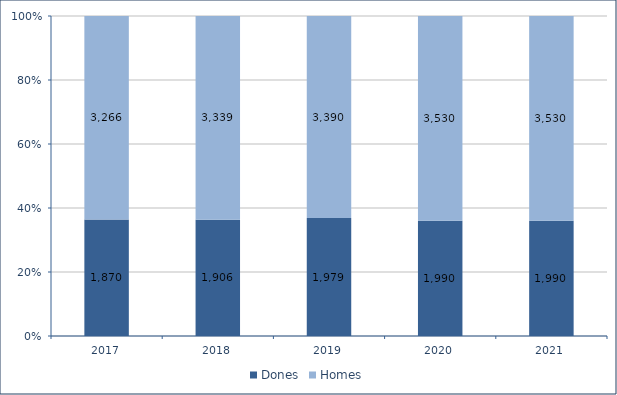
| Category | Dones | Homes |
|---|---|---|
| 2017.0 | 1870 | 3266 |
| 2018.0 | 1906 | 3339 |
| 2019.0 | 1979 | 3390 |
| 2020.0 | 1990 | 3530 |
| 2021.0 | 1990 | 3530 |